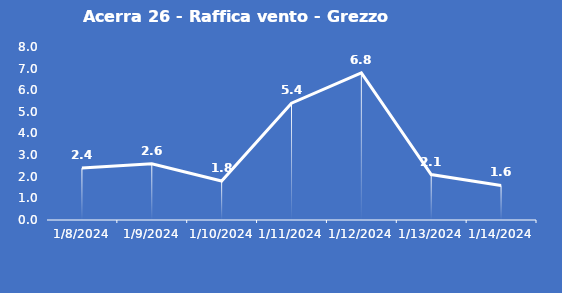
| Category | Acerra 26 - Raffica vento - Grezzo (m/s) |
|---|---|
| 1/8/24 | 2.4 |
| 1/9/24 | 2.6 |
| 1/10/24 | 1.8 |
| 1/11/24 | 5.4 |
| 1/12/24 | 6.8 |
| 1/13/24 | 2.1 |
| 1/14/24 | 1.6 |